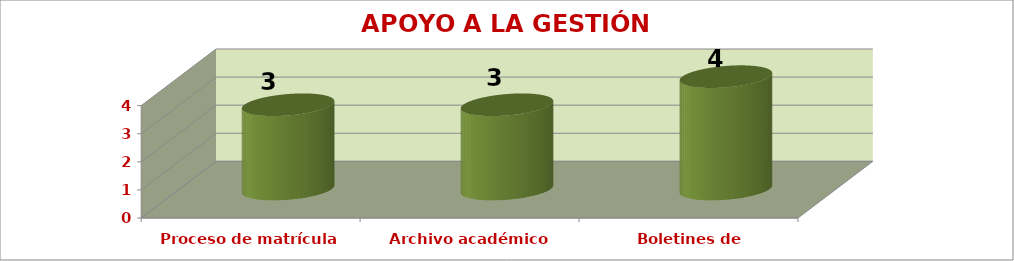
| Category | APOYO A LA GESTIÓN ACADÉMICA |
|---|---|
| Proceso de matrícula | 3 |
| Archivo académico | 3 |
| Boletines de calificaciones | 4 |